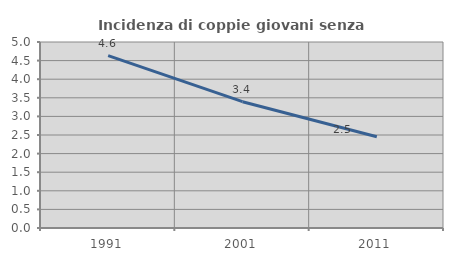
| Category | Incidenza di coppie giovani senza figli |
|---|---|
| 1991.0 | 4.633 |
| 2001.0 | 3.395 |
| 2011.0 | 2.452 |